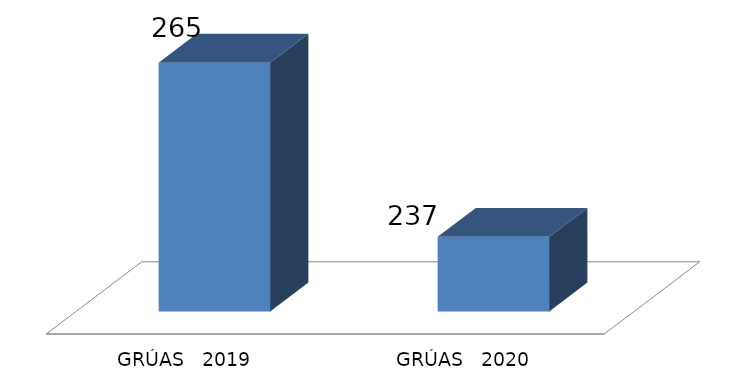
| Category | Series 0 |
|---|---|
| GRÚAS   2019 | 265 |
| GRÚAS   2020 | 237 |